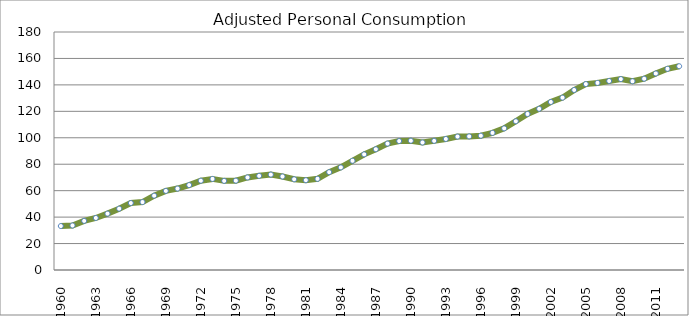
| Category | Series 0 |
|---|---|
| 1960.0 | 33.242 |
| 1961.0 | 33.674 |
| 1962.0 | 37.15 |
| 1963.0 | 39.362 |
| 1964.0 | 42.637 |
| 1965.0 | 46.4 |
| 1966.0 | 50.64 |
| 1967.0 | 51.375 |
| 1968.0 | 56.23 |
| 1969.0 | 59.816 |
| 1970.0 | 61.59 |
| 1971.0 | 64.22 |
| 1972.0 | 67.525 |
| 1973.0 | 68.889 |
| 1974.0 | 67.415 |
| 1975.0 | 67.583 |
| 1976.0 | 70.004 |
| 1977.0 | 71.213 |
| 1978.0 | 72.169 |
| 1979.0 | 70.717 |
| 1980.0 | 68.613 |
| 1981.0 | 67.914 |
| 1982.0 | 68.941 |
| 1983.0 | 73.988 |
| 1984.0 | 77.596 |
| 1985.0 | 82.587 |
| 1986.0 | 87.451 |
| 1987.0 | 91.333 |
| 1988.0 | 95.602 |
| 1989.0 | 97.517 |
| 1990.0 | 97.78 |
| 1991.0 | 96.437 |
| 1992.0 | 97.682 |
| 1993.0 | 99.108 |
| 1994.0 | 100.904 |
| 1995.0 | 101.034 |
| 1996.0 | 101.583 |
| 1997.0 | 103.691 |
| 1998.0 | 107.1 |
| 1999.0 | 112.492 |
| 2000.0 | 118.007 |
| 2001.0 | 121.92 |
| 2002.0 | 127.082 |
| 2003.0 | 130.345 |
| 2004.0 | 136.149 |
| 2005.0 | 140.624 |
| 2006.0 | 141.498 |
| 2007.0 | 142.951 |
| 2008.0 | 144.381 |
| 2009.0 | 142.778 |
| 2010.0 | 144.686 |
| 2011.0 | 148.624 |
| 2012.0 | 152.156 |
| 2013.0 | 154.111 |